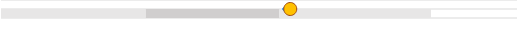
| Category | left | mid start | mid end | right |
|---|---|---|---|---|
| 0 | 0 | 0.337 | 0.31 | 0.353 |